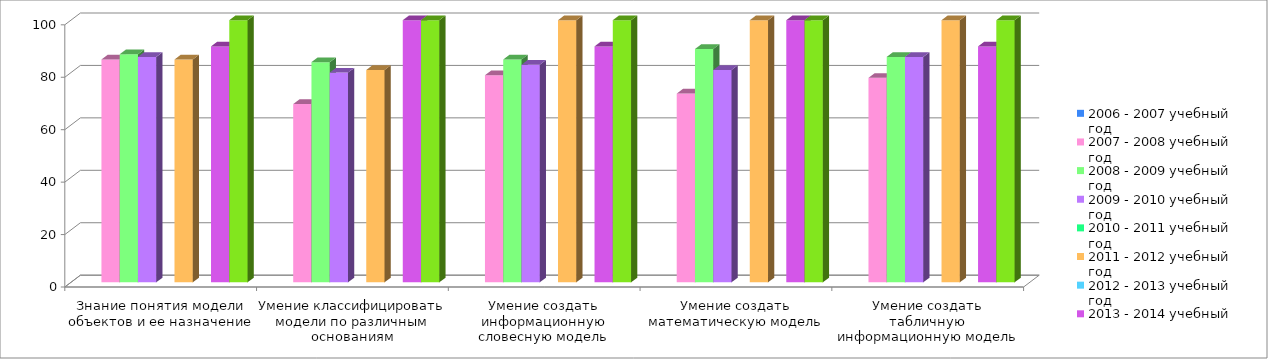
| Category | 2006 - 2007 учебный год | 2007 - 2008 учебный год | 2008 - 2009 учебный год | 2009 - 2010 учебный год | 2010 - 2011 учебный год | 2011 - 2012 учебный год | 2012 - 2013 учебный год | 2013 - 2014 учебный год | 2014 - 2015 учебный год |
|---|---|---|---|---|---|---|---|---|---|
| Знание понятия модели объектов и ее назначение |  | 85 | 87 | 86 |  | 85 |  | 90 | 100 |
| Умение классифицировать модели по различным основаниям |  | 68 | 84 | 80 |  | 81 |  | 100 | 100 |
| Умение создать информационную словесную модель |  | 79 | 85 | 83 |  | 100 |  | 90 | 100 |
| Умение создать математическую модель |  | 72 | 89 | 81 |  | 100 |  | 100 | 100 |
| Умение создать табличную информационную модель |  | 78 | 86 | 86 |  | 100 |  | 90 | 100 |